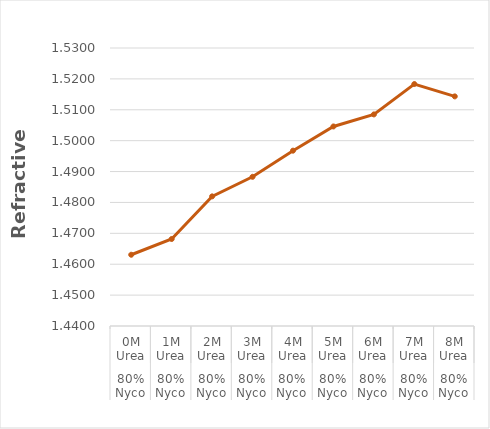
| Category | Series 0 |
|---|---|
| 0 | 1.463 |
| 1 | 1.468 |
| 2 | 1.482 |
| 3 | 1.488 |
| 4 | 1.497 |
| 5 | 1.505 |
| 6 | 1.508 |
| 7 | 1.518 |
| 8 | 1.514 |